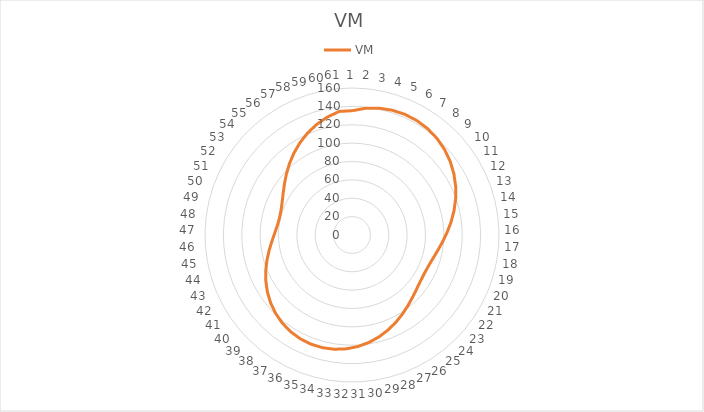
| Category | VM |
|---|---|
| 0 | 135.24 |
| 1 | 138.578 |
| 2 | 141.077 |
| 3 | 142.689 |
| 4 | 143.387 |
| 5 | 143.163 |
| 6 | 142.029 |
| 7 | 140.019 |
| 8 | 137.184 |
| 9 | 133.599 |
| 10 | 129.36 |
| 11 | 124.588 |
| 12 | 119.427 |
| 13 | 114.051 |
| 14 | 108.659 |
| 15 | 103.478 |
| 16 | 98.756 |
| 17 | 94.749 |
| 18 | 91.699 |
| 19 | 89.801 |
| 20 | 89.173 |
| 21 | 89.825 |
| 22 | 91.659 |
| 23 | 94.486 |
| 24 | 98.064 |
| 25 | 102.128 |
| 26 | 106.42 |
| 27 | 110.702 |
| 28 | 114.769 |
| 29 | 118.446 |
| 30 | 121.588 |
| 31 | 124.082 |
| 32 | 125.839 |
| 33 | 126.798 |
| 34 | 126.922 |
| 35 | 126.196 |
| 36 | 124.631 |
| 37 | 122.258 |
| 38 | 119.137 |
| 39 | 115.352 |
| 40 | 111.015 |
| 41 | 106.272 |
| 42 | 101.301 |
| 43 | 96.323 |
| 44 | 91.594 |
| 45 | 87.408 |
| 46 | 84.074 |
| 47 | 81.889 |
| 48 | 81.084 |
| 49 | 81.78 |
| 50 | 83.954 |
| 51 | 87.451 |
| 52 | 92.02 |
| 53 | 97.368 |
| 54 | 103.199 |
| 55 | 109.237 |
| 56 | 115.241 |
| 57 | 121.002 |
| 58 | 126.347 |
| 59 | 131.132 |
| 60 | 135.24 |